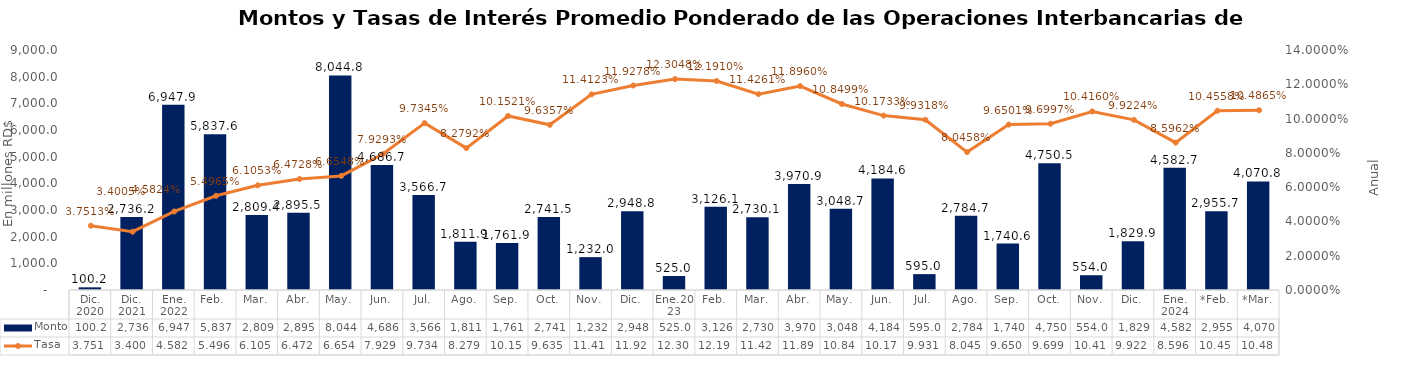
| Category | Monto |
|---|---|
| Dic. 2020 | 100.201 |
| Dic. 2021 | 2736.2 |
| Ene. 2022 | 6947.9 |
| Feb.  | 5837.6 |
| Mar. | 2809.4 |
| Abr. | 2895.51 |
| May. | 8044.816 |
| Jun. | 4686.669 |
| Jul. | 3566.685 |
| Ago. | 1811.857 |
| Sep. | 1761.897 |
| Oct. | 2741.5 |
| Nov. | 1231.977 |
| Dic. | 2948.8 |
| Ene.2023 | 525 |
| Feb. | 3126.05 |
| Mar. | 2730.1 |
| Abr. | 3970.921 |
| May. | 3048.675 |
| Jun. | 4184.629 |
| Jul. | 595 |
| Ago. | 2784.7 |
| Sep. | 1740.568 |
| Oct. | 4750.52 |
| Nov. | 554.01 |
| Dic. | 1829.874 |
| Ene. 2024 | 4582.692 |
| *Feb. | 2955.7 |
| *Mar. | 4070.8 |